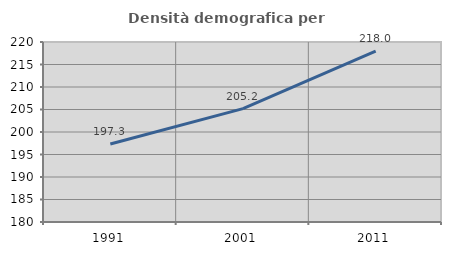
| Category | Densità demografica |
|---|---|
| 1991.0 | 197.32 |
| 2001.0 | 205.193 |
| 2011.0 | 217.987 |